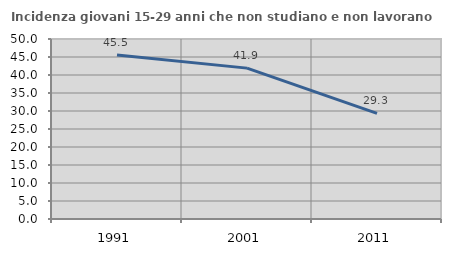
| Category | Incidenza giovani 15-29 anni che non studiano e non lavorano  |
|---|---|
| 1991.0 | 45.528 |
| 2001.0 | 41.912 |
| 2011.0 | 29.326 |